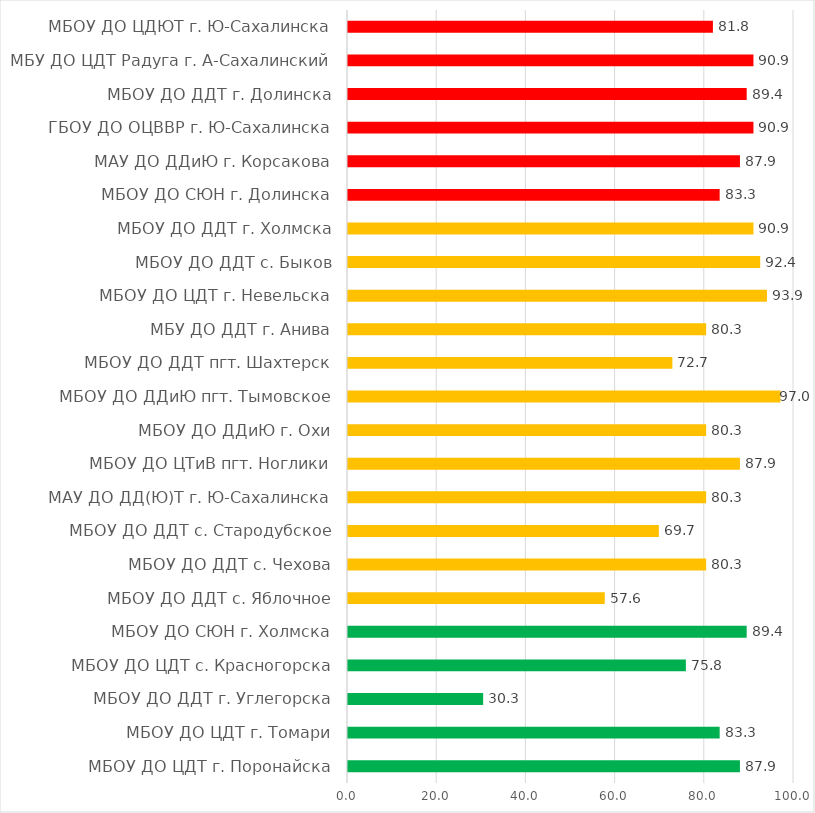
| Category | Series 0 |
|---|---|
| МБОУ ДО ЦДТ г. Поронайска | 87.879 |
| МБОУ ДО ЦДТ г. Томари | 83.333 |
| МБОУ ДО ДДТ г. Углегорска | 30.303 |
| МБОУ ДО ЦДТ с. Красногорска | 75.758 |
| МБОУ ДО СЮН г. Холмска | 89.394 |
| МБОУ ДО ДДТ с. Яблочное | 57.576 |
| МБОУ ДО ДДТ с. Чехова | 80.303 |
| МБОУ ДО ДДТ с. Стародубское | 69.697 |
| МАУ ДО ДД(Ю)Т г. Ю-Сахалинска | 80.303 |
| МБОУ ДО ЦТиВ пгт. Ноглики | 87.879 |
| МБОУ ДО ДДиЮ г. Охи | 80.303 |
| МБОУ ДО ДДиЮ пгт. Тымовское | 96.97 |
| МБОУ ДО ДДТ пгт. Шахтерск | 72.727 |
| МБУ ДО ДДТ г. Анива | 80.303 |
| МБОУ ДО ЦДТ г. Невельска | 93.939 |
| МБОУ ДО ДДТ с. Быков | 92.424 |
| МБОУ ДО ДДТ г. Холмска | 90.909 |
| МБОУ ДО СЮН г. Долинска | 83.333 |
| МАУ ДО ДДиЮ г. Корсакова | 87.879 |
| ГБОУ ДО ОЦВВР г. Ю-Сахалинска | 90.909 |
| МБОУ ДО ДДТ г. Долинска | 89.394 |
| МБУ ДО ЦДТ Радуга г. А-Сахалинский | 90.909 |
| МБОУ ДО ЦДЮТ г. Ю-Сахалинска | 81.818 |